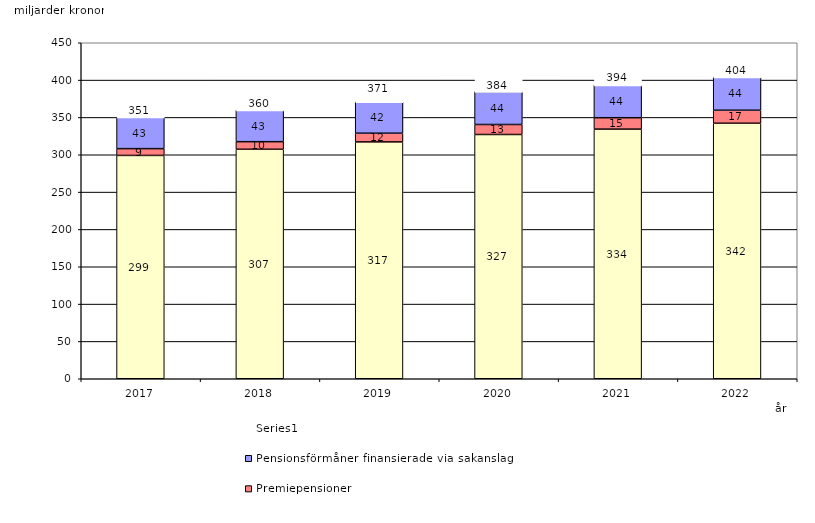
| Category | Inkomstpension och tilläggspension m.m. | Premiepensioner | Pensionsförmåner finansierade via sakanslag | Series 0 |
|---|---|---|---|---|
| 2017.0 | 299.103 | 9.081 | 42.508 | 20 |
| 2018.0 | 307.355 | 10.141 | 42.538 | 20 |
| 2019.0 | 317.21 | 11.656 | 42.105 | 20 |
| 2020.0 | 327.131 | 13.385 | 44.156 | 20 |
| 2021.0 | 334.335 | 15.279 | 43.948 | 20 |
| 2022.0 | 342.218 | 17.419 | 44.478 | 20 |